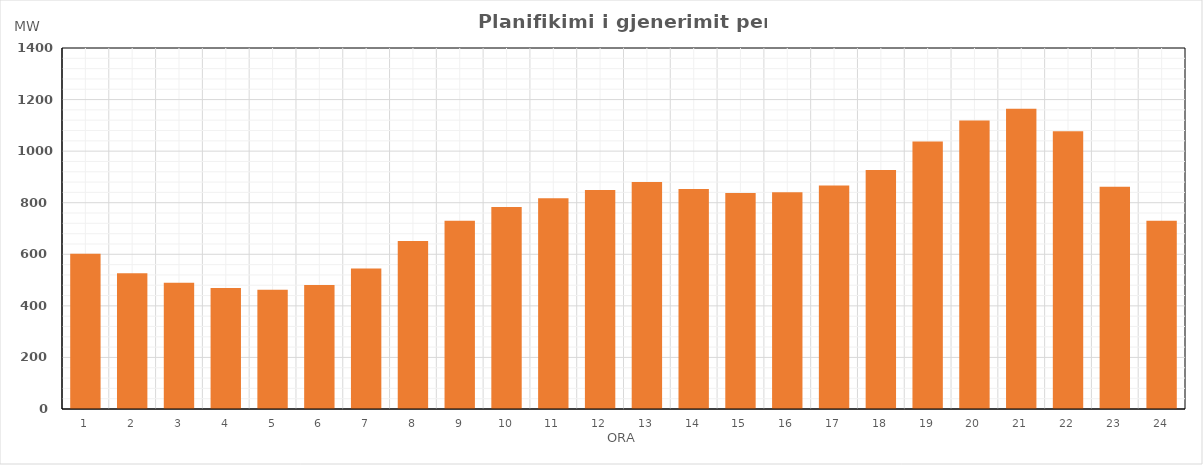
| Category | Max (MW) |
|---|---|
| 0 | 601.94 |
| 1 | 526.51 |
| 2 | 490.01 |
| 3 | 469.71 |
| 4 | 462.11 |
| 5 | 480.58 |
| 6 | 544.95 |
| 7 | 651.11 |
| 8 | 730.22 |
| 9 | 783.1 |
| 10 | 817.3 |
| 11 | 849.22 |
| 12 | 880.69 |
| 13 | 852.77 |
| 14 | 838 |
| 15 | 840.23 |
| 16 | 866.67 |
| 17 | 926.76 |
| 18 | 1037.02 |
| 19 | 1118.8 |
| 20 | 1164.53 |
| 21 | 1077.1 |
| 22 | 861.71 |
| 23 | 730.13 |